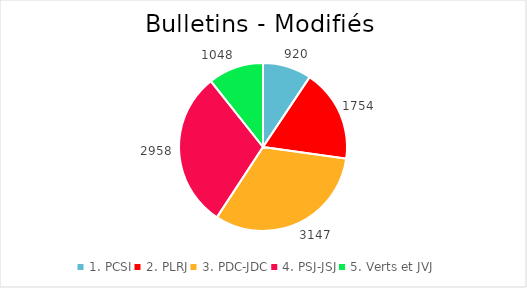
| Category | Series 0 |
|---|---|
| 1. PCSI | 920 |
| 2. PLRJ | 1754 |
| 3. PDC-JDC | 3147 |
| 4. PSJ-JSJ | 2958 |
| 5. Verts et JVJ | 1048 |